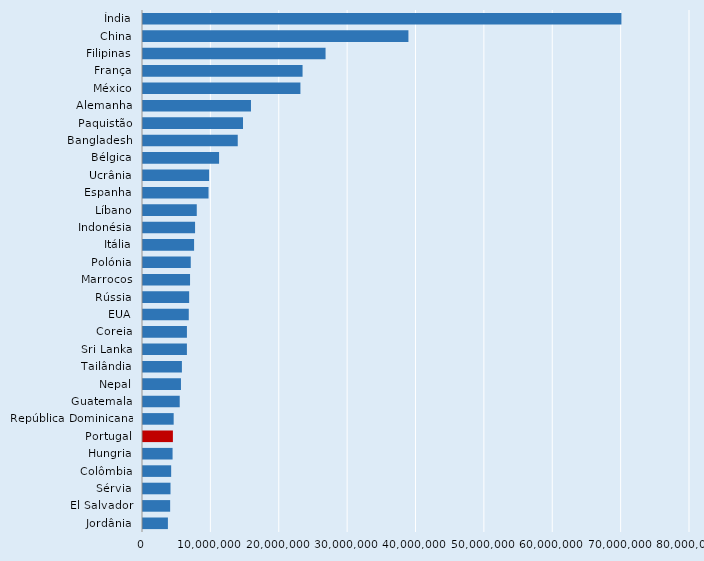
| Category | Series 0 |
|---|---|
| Índia | 69970361 |
| China | 38818824 |
| Filipinas | 26699667 |
| França | 23336429 |
| México | 23022470 |
| Alemanha | 15791512 |
| Paquistão | 14626000 |
| Bangladesh | 13857128 |
| Bélgica | 11126212 |
| Ucrânia | 9667000 |
| Espanha | 9583975 |
| Líbano | 7863564 |
| Indonésia | 7614419 |
| Itália | 7471027 |
| Polónia | 6984000 |
| Marrocos | 6881700 |
| Rússia | 6750810 |
| EUA | 6695000 |
| Coreia | 6424800 |
| Sri Lanka | 6422187 |
| Tailândia | 5689777 |
| Nepal | 5551528 |
| Guatemala | 5370645 |
| República Dominicana | 4485500 |
| Portugal | 4372366 |
| Hungria | 4325360 |
| Colômbia | 4119493 |
| Sérvia | 4022603 |
| El Salvador | 3971079 |
| Jordânia | 3642676 |